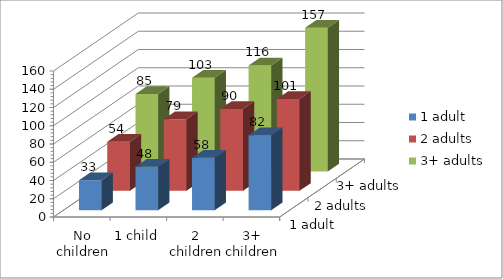
| Category | 1 adult | 2 adults | 3+ adults |
|---|---|---|---|
| No children | 32.85 | 53.725 | 85.092 |
| 1 child | 47.612 | 78.511 | 102.889 |
| 2 children | 57.526 | 89.8 | 116.227 |
| 3+ children | 82.125 | 100.804 | 157.481 |